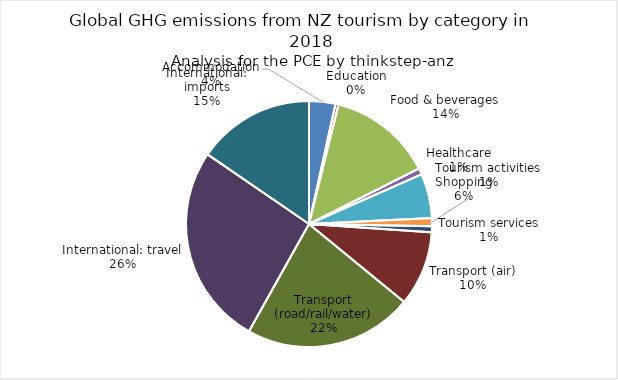
| Category | Series 0 |
|---|---|
| Accommodation | 444.584 |
| Education | 51.488 |
| Food & beverages | 1762.51 |
| Healthcare | 107.226 |
| Shopping | 750.81 |
| Tourism activities | 137.873 |
| Tourism services | 101.831 |
| Transport (air) | 1265.596 |
| Transport (road/rail/water) | 2856.156 |
| International: travel | 3403.229 |
| International: imports | 1985.999 |